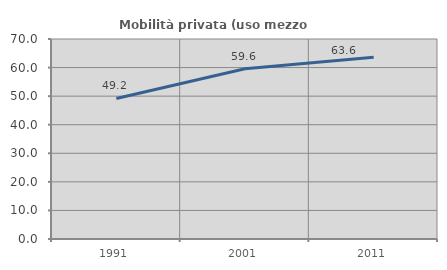
| Category | Mobilità privata (uso mezzo privato) |
|---|---|
| 1991.0 | 49.204 |
| 2001.0 | 59.564 |
| 2011.0 | 63.578 |